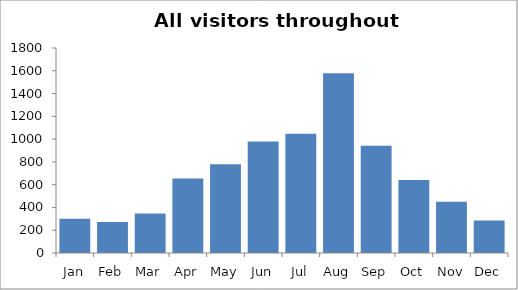
| Category | 2018 |
|---|---|
| Jan | 300 |
| Feb | 272 |
| Mar | 346 |
| Apr | 654 |
| May | 780 |
| Jun | 980 |
| Jul | 1046 |
| Aug | 1578 |
| Sep | 942 |
| Oct | 640 |
| Nov | 451 |
| Dec | 285 |